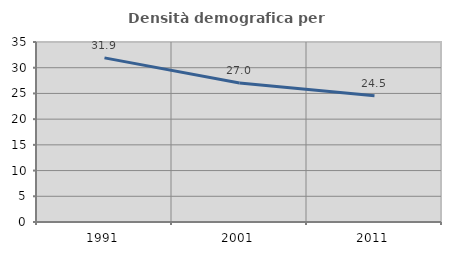
| Category | Densità demografica |
|---|---|
| 1991.0 | 31.914 |
| 2001.0 | 27.035 |
| 2011.0 | 24.529 |